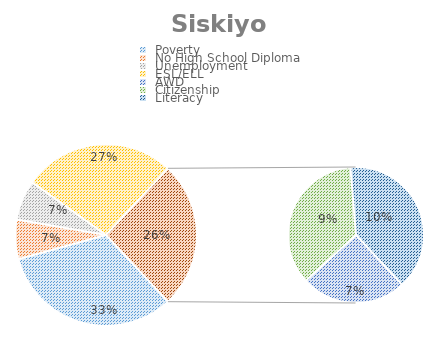
| Category | Siskiyou |
|---|---|
| Poverty | 22674 |
| No High School Diploma | 4878 |
| Unemployment | 4969 |
| ESL/ELL | 18788 |
| AWD | 4572 |
| Citizenship | 6453 |
| Literacy | 7167 |